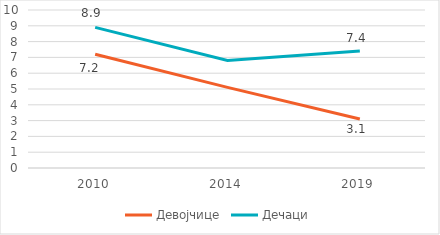
| Category | Девојчице | Дечаци |
|---|---|---|
| 2010.0 | 7.2 | 8.9 |
| 2014.0 | 5.1 | 6.8 |
| 2019.0 | 3.1 | 7.4 |